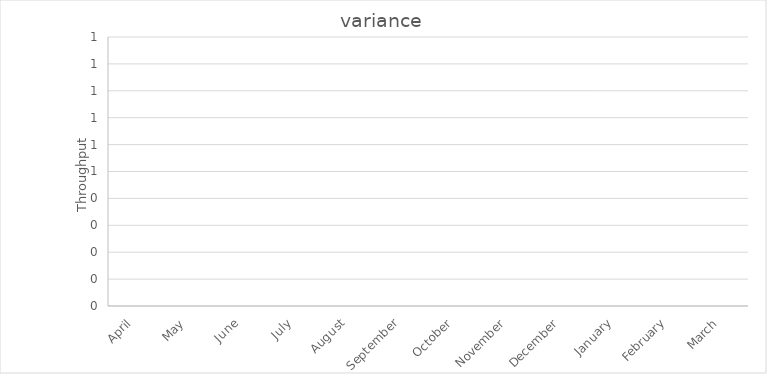
| Category | variance |
|---|---|
| April | 0 |
| May | 0 |
| June | 0 |
| July | 0 |
| August | 0 |
| September | 0 |
| October | 0 |
| November | 0 |
| December | 0 |
| January | 0 |
| February | 0 |
| March | 0 |